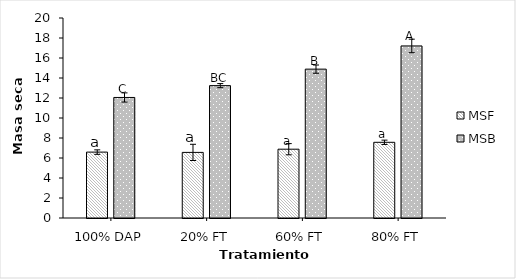
| Category | MSF | MSB |
|---|---|---|
| 100% DAP | 6.59 | 12.053 |
| 20% FT | 6.56 | 13.237 |
| 60% FT | 6.88 | 14.887 |
| 80% FT | 7.57 | 17.207 |